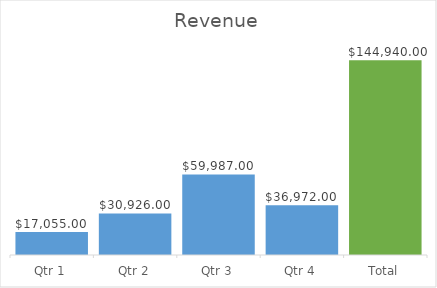
| Category | Revenue |
|---|---|
| Qtr 1 | 17055 |
| Qtr 2 | 30926 |
| Qtr 3 | 59987 |
| Qtr 4 | 36972 |
| Total | 144940 |